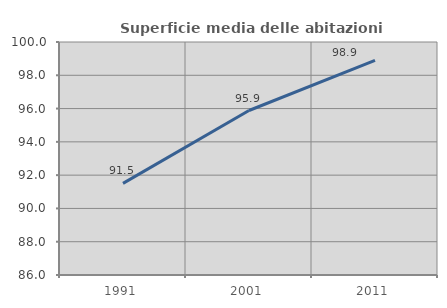
| Category | Superficie media delle abitazioni occupate |
|---|---|
| 1991.0 | 91.507 |
| 2001.0 | 95.884 |
| 2011.0 | 98.89 |